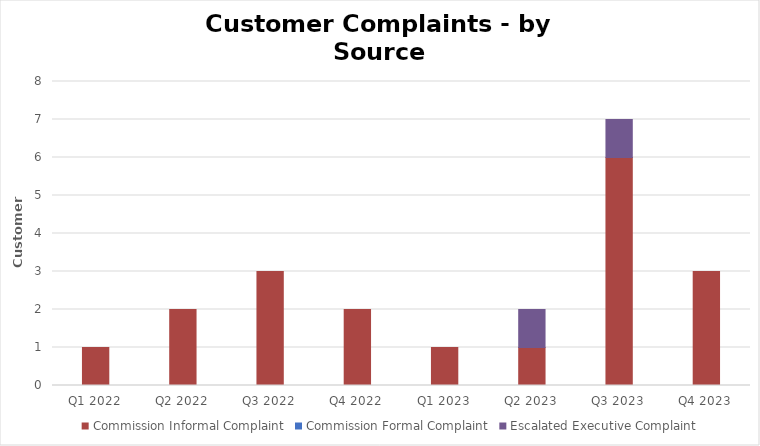
| Category | Commission Informal Complaint | Commission Formal Complaint | Escalated Executive Complaint |
|---|---|---|---|
| Q1 2022 | 1 | 0 | 0 |
| Q2 2022 | 2 | 0 | 0 |
| Q3 2022 | 3 | 0 | 0 |
| Q4 2022 | 2 | 0 | 0 |
| Q1 2023 | 1 | 0 | 0 |
| Q2 2023 | 1 | 0 | 1 |
| Q3 2023 | 6 | 0 | 1 |
| Q4 2023 | 3 | 0 | 0 |